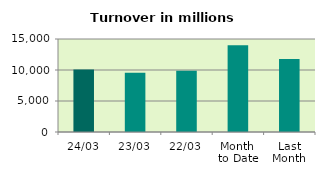
| Category | Series 0 |
|---|---|
| 24/03 | 10089.248 |
| 23/03 | 9570.459 |
| 22/03 | 9882.788 |
| Month 
to Date | 14001.826 |
| Last
Month | 11787.675 |